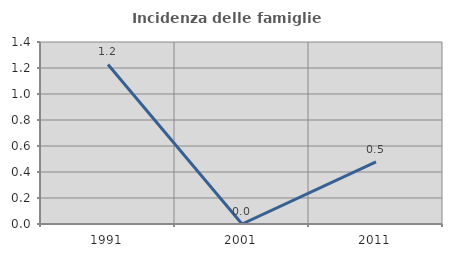
| Category | Incidenza delle famiglie numerose |
|---|---|
| 1991.0 | 1.227 |
| 2001.0 | 0 |
| 2011.0 | 0.478 |